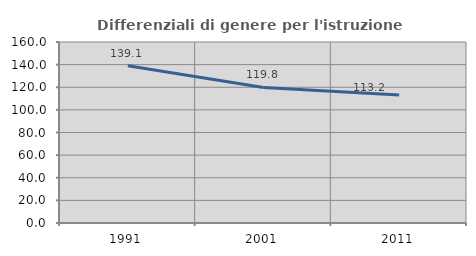
| Category | Differenziali di genere per l'istruzione superiore |
|---|---|
| 1991.0 | 139.08 |
| 2001.0 | 119.798 |
| 2011.0 | 113.208 |